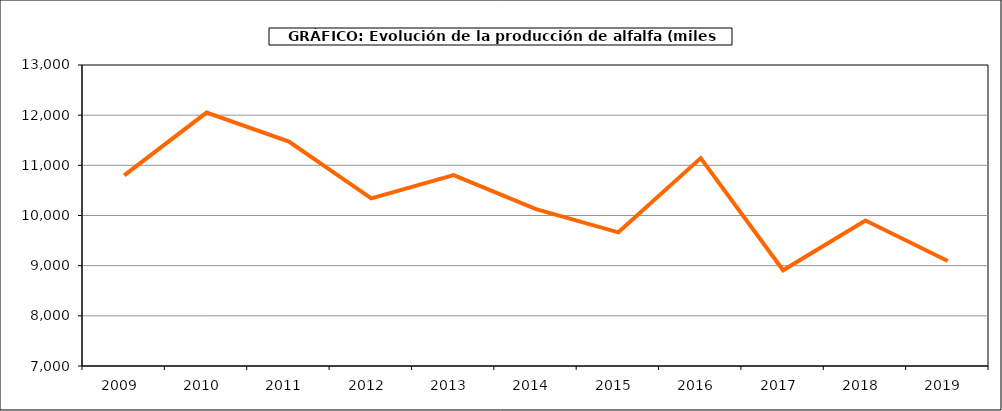
| Category | Producción |
|---|---|
| 2009.0 | 10799.35 |
| 2010.0 | 12051.422 |
| 2011.0 | 11474.193 |
| 2012.0 | 10342.799 |
| 2013.0 | 10806.54 |
| 2014.0 | 10126.971 |
| 2015.0 | 9664.728 |
| 2016.0 | 11143.962 |
| 2017.0 | 8908.163 |
| 2018.0 | 9900.827 |
| 2019.0 | 9093.858 |